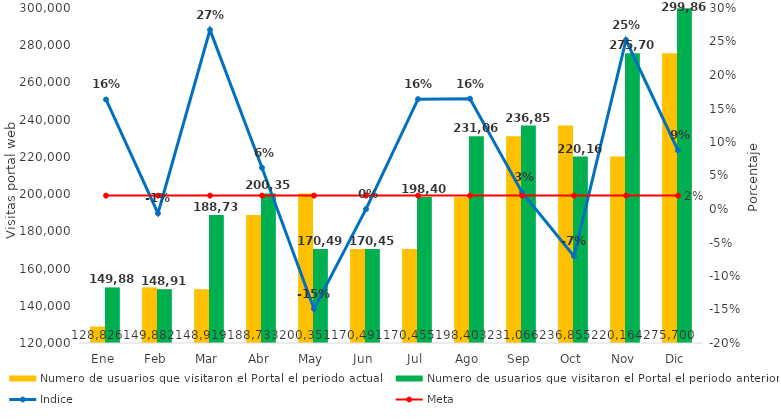
| Category | Numero de usuarios que visitaron el Portal el periodo actual | Numero de usuarios que visitaron el Portal el periodo anterior |
|---|---|---|
| 0 | 128826 | 149882 |
| 1 | 149882 | 148919 |
| 2 | 148919 | 188733 |
| 3 | 188733 | 200351 |
| 4 | 200351 | 170491 |
| 5 | 170491 | 170455 |
| 6 | 170455 | 198403 |
| 7 | 198403 | 231066 |
| 8 | 231066 | 236855 |
| 9 | 236855 | 220164 |
| 10 | 220164 | 275700 |
| 11 | 275700 | 299860 |